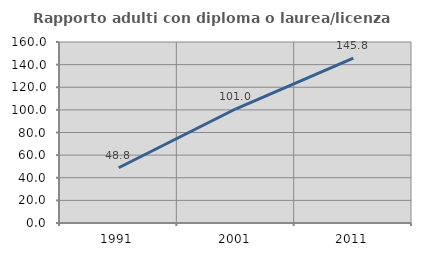
| Category | Rapporto adulti con diploma o laurea/licenza media  |
|---|---|
| 1991.0 | 48.844 |
| 2001.0 | 100.98 |
| 2011.0 | 145.833 |